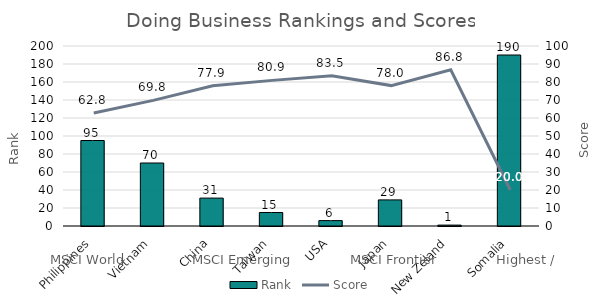
| Category | Rank |
|---|---|
| Philippines | 95 |
| Vietnam | 70 |
| China | 31 |
| Taiwan | 15 |
| USA | 6 |
| Japan | 29 |
| New Zeland | 1 |
| Somalia | 190 |